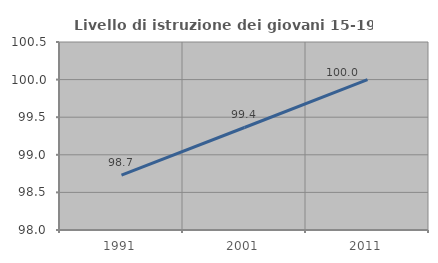
| Category | Livello di istruzione dei giovani 15-19 anni |
|---|---|
| 1991.0 | 98.729 |
| 2001.0 | 99.363 |
| 2011.0 | 100 |